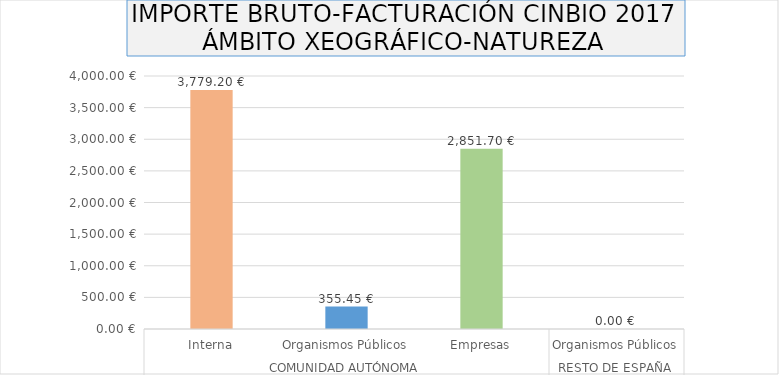
| Category | Series 0 |
|---|---|
| 0 | 3779.2 |
| 1 | 355.45 |
| 2 | 2851.7 |
| 3 | 0 |